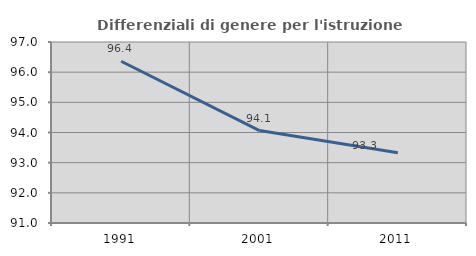
| Category | Differenziali di genere per l'istruzione superiore |
|---|---|
| 1991.0 | 96.361 |
| 2001.0 | 94.064 |
| 2011.0 | 93.326 |